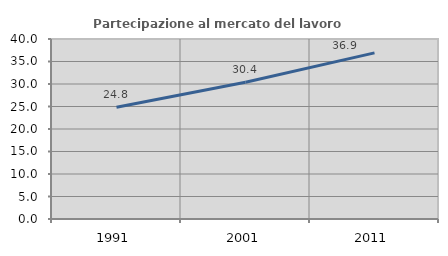
| Category | Partecipazione al mercato del lavoro  femminile |
|---|---|
| 1991.0 | 24.828 |
| 2001.0 | 30.405 |
| 2011.0 | 36.913 |